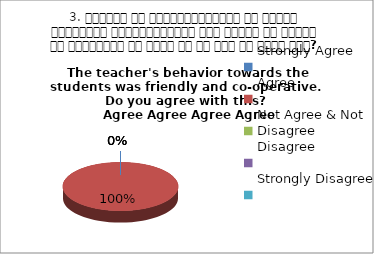
| Category | 3. शिक्षक का विद्यार्थियों के प्रति व्यव्हार मित्रतापूर्ण एवं सहयोग के भावना से परिपूर्ण था क्या आप इस बात से सहमत हैं? 
The teacher's behavior towards the students was friendly and co-operative.  Do you agree with this? 
 Agree Agree Agree Agree |
|---|---|
| Strongly Agree | 0 |
| Agree | 4 |
| Not Agree & Not Disagree | 0 |
| Disagree | 0 |
| Strongly Disagree | 0 |